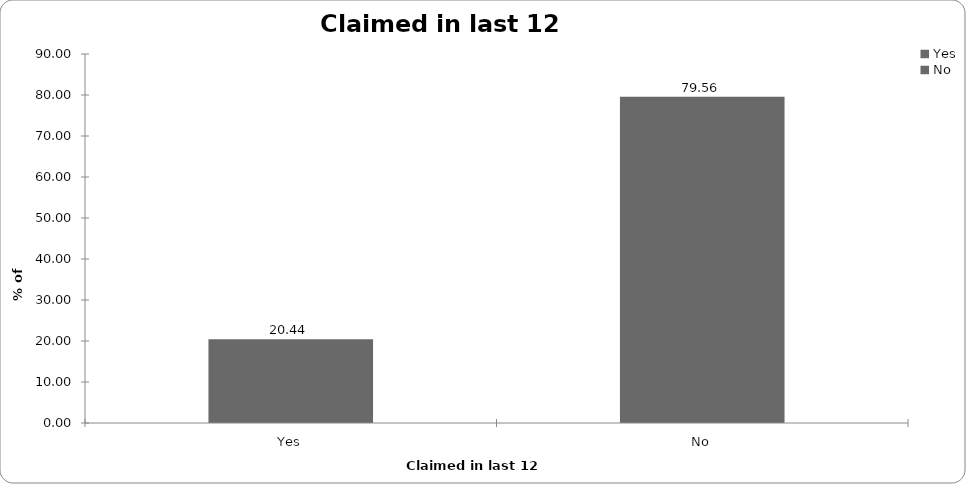
| Category | Claimed in last 12 months |
|---|---|
| Yes | 20.441 |
| No | 79.559 |